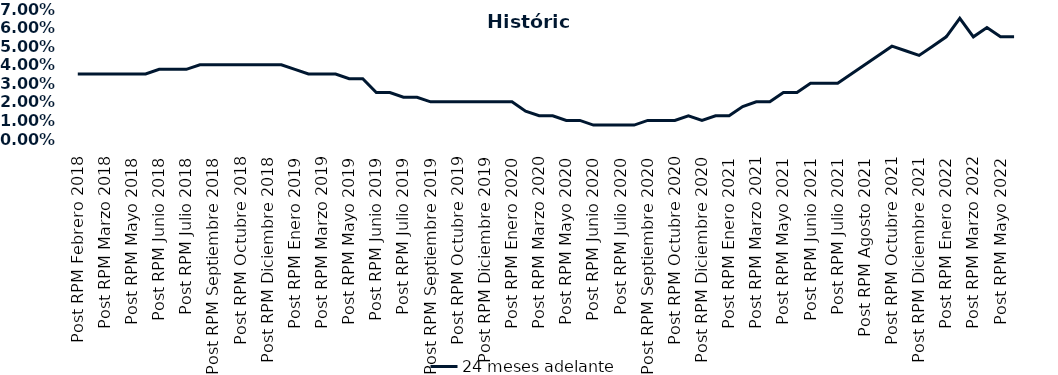
| Category | 24 meses adelante  |
|---|---|
| Post RPM Febrero 2018 | 0.035 |
| Pre RPM Marzo 2018 | 0.035 |
| Post RPM Marzo 2018 | 0.035 |
| Pre RPM Mayo 2018 | 0.035 |
| Post RPM Mayo 2018 | 0.035 |
| Pre RPM Junio 2018 | 0.035 |
| Post RPM Junio 2018 | 0.038 |
| Pre RPM Julio 2018 | 0.038 |
| Post RPM Julio 2018 | 0.038 |
| Pre RPM Septiembre 2018 | 0.04 |
| Post RPM Septiembre 2018 | 0.04 |
| Pre RPM Octubre 2018 | 0.04 |
| Post RPM Octubre 2018 | 0.04 |
| Pre RPM Diciembre 2018 | 0.04 |
| Post RPM Diciembre 2018 | 0.04 |
| Pre RPM Enero 2019 | 0.04 |
| Post RPM Enero 2019 | 0.038 |
| Pre RPM Marzo 2019 | 0.035 |
| Post RPM Marzo 2019 | 0.035 |
| Pre RPM Mayo 2019 | 0.035 |
| Post RPM Mayo 2019 | 0.032 |
| Pre RPM Junio 2019 | 0.032 |
| Post RPM Junio 2019 | 0.025 |
| Pre RPM Julio 2019 | 0.025 |
| Post RPM Julio 2019 | 0.022 |
| Pre RPM Septiembre 2019 | 0.022 |
| Post RPM Septiembre 2019 | 0.02 |
| Pre RPM Octubre 2019 | 0.02 |
| Post RPM Octubre 2019 | 0.02 |
| Pre RPM Diciembre 2019 | 0.02 |
| Post RPM Diciembre 2019 | 0.02 |
| Pre RPM Enero 2020 | 0.02 |
| Post RPM Enero 2020 | 0.02 |
| Pre RPM Marzo 2020 | 0.015 |
| Post RPM Marzo 2020 | 0.012 |
| Pre RPM Mayo 2020 | 0.012 |
| Post RPM Mayo 2020 | 0.01 |
| Pre RPM Junio 2020 | 0.01 |
| Post RPM Junio 2020 | 0.008 |
| Pre RPM Julio 2020 | 0.008 |
| Post RPM Julio 2020 | 0.008 |
| Pre RPM Septiembre 2020 | 0.008 |
| Post RPM Septiembre 2020 | 0.01 |
| Pre RPM Octubre 2020 | 0.01 |
| Post RPM Octubre 2020 | 0.01 |
| Pre RPM Diciembre 2020 | 0.012 |
| Post RPM Diciembre 2020 | 0.01 |
| Pre RPM Enero 2021 | 0.012 |
| Post RPM Enero 2021 | 0.012 |
| Pre RPM Marzo 2021 | 0.018 |
| Post RPM Marzo 2021 | 0.02 |
| Pre RPM Mayo 2021 | 0.02 |
| Post RPM Mayo 2021 | 0.025 |
| Pre RPM Junio 2021 | 0.025 |
| Post RPM Junio 2021 | 0.03 |
| Pre RPM Julio 2021 | 0.03 |
| Post RPM Julio 2021 | 0.03 |
| Pre RPM Agosto 2021 | 0.035 |
| Post RPM Agosto 2021 | 0.04 |
| Pre RPM Octubre 2021 | 0.045 |
| Post RPM Octubre 2021 | 0.05 |
| Pre RPM Diciembre 2021 | 0.048 |
| Post RPM Diciembre 2021 | 0.045 |
| Pre RPM Enero 2022 | 0.05 |
| Post RPM Enero 2022 | 0.055 |
| Pre RPM Marzo 2022 | 0.065 |
| Post RPM Marzo 2022 | 0.055 |
| Pre RPM Mayo 2022 | 0.06 |
| Post RPM Mayo 2022 | 0.055 |
| Pre RPM Junio 2022 | 0.055 |